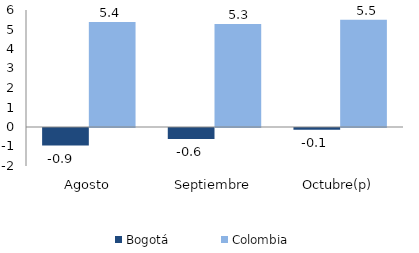
| Category | Bogotá | Colombia |
|---|---|---|
| Agosto | -0.898 | 5.381 |
| Septiembre | -0.57 | 5.282 |
| Octubre(p) | -0.091 | 5.499 |